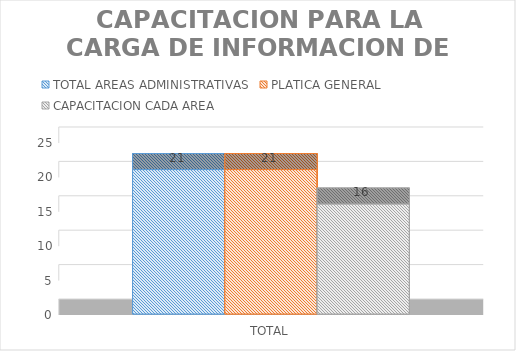
| Category | TOTAL AREAS ADMINISTRATIVAS | PLATICA GENERAL | CAPACITACION CADA AREA |
|---|---|---|---|
| TOTAL | 21 | 21 | 16 |